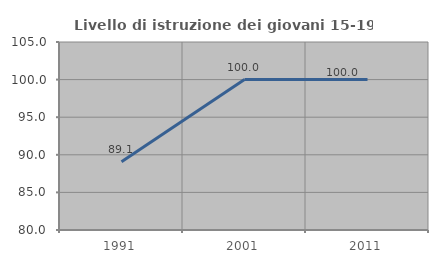
| Category | Livello di istruzione dei giovani 15-19 anni |
|---|---|
| 1991.0 | 89.062 |
| 2001.0 | 100 |
| 2011.0 | 100 |